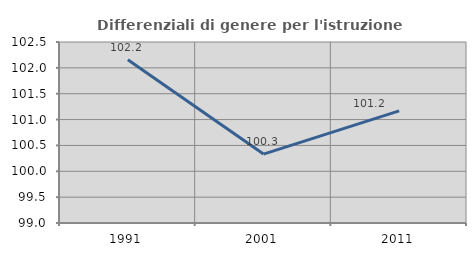
| Category | Differenziali di genere per l'istruzione superiore |
|---|---|
| 1991.0 | 102.155 |
| 2001.0 | 100.332 |
| 2011.0 | 101.169 |